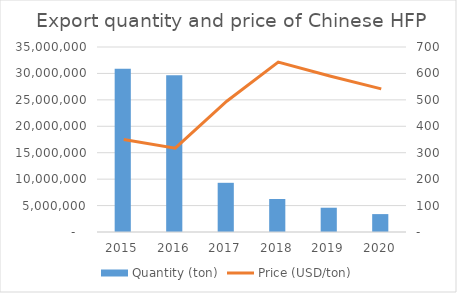
| Category | Quantity (ton) |
|---|---|
| 2015.0 | 30885773.067 |
| 2016.0 | 29640983.939 |
| 2017.0 | 9307090.53 |
| 2018.0 | 6242682.842 |
| 2019.0 | 4591481.281 |
| 2020.0 | 3385888.369 |